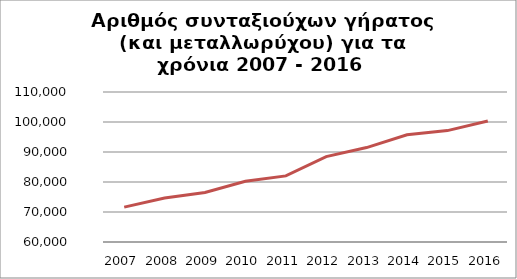
| Category | Series 1 |
|---|---|
| 2007.0 | 71621 |
| 2008.0 | 74642 |
| 2009.0 | 76508 |
| 2010.0 | 80261 |
| 2011.0 | 82038 |
| 2012.0 | 88453 |
| 2013.0 | 91472 |
| 2014.0 | 95747 |
| 2015.0 | 97134 |
| 2016.0 | 100305 |